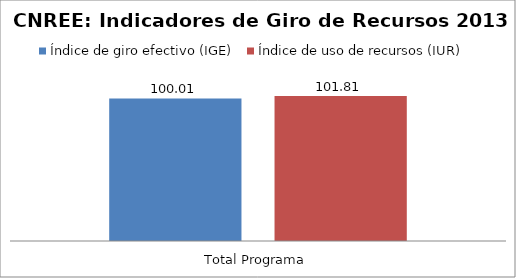
| Category | Índice de giro efectivo (IGE) | Índice de uso de recursos (IUR)  |
|---|---|---|
| Total Programa | 100.008 | 101.814 |